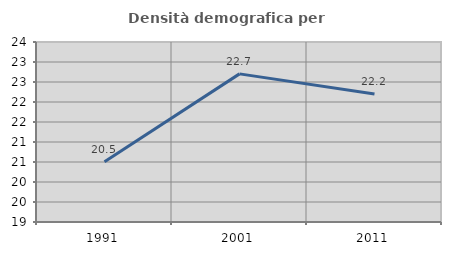
| Category | Densità demografica |
|---|---|
| 1991.0 | 20.506 |
| 2001.0 | 22.703 |
| 2011.0 | 22.202 |